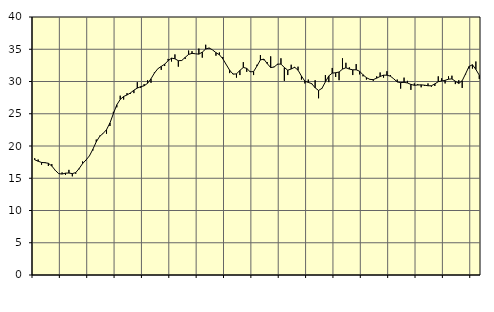
| Category | Piggar | Series 1 |
|---|---|---|
| nan | 18.1 | 17.86 |
| 87.0 | 17.9 | 17.64 |
| 87.0 | 17.1 | 17.45 |
| 87.0 | 17.5 | 17.41 |
| nan | 16.9 | 17.32 |
| 88.0 | 17.2 | 16.9 |
| 88.0 | 16.2 | 16.24 |
| 88.0 | 15.7 | 15.72 |
| nan | 15.9 | 15.65 |
| 89.0 | 15.5 | 15.79 |
| 89.0 | 16.3 | 15.81 |
| 89.0 | 15.3 | 15.72 |
| nan | 15.7 | 15.88 |
| 90.0 | 16.4 | 16.51 |
| 90.0 | 17.6 | 17.27 |
| 90.0 | 17.8 | 17.83 |
| nan | 18.5 | 18.47 |
| 91.0 | 19.3 | 19.49 |
| 91.0 | 21 | 20.65 |
| 91.0 | 21.6 | 21.49 |
| nan | 21.9 | 21.95 |
| 92.0 | 21.9 | 22.53 |
| 92.0 | 23.1 | 23.57 |
| 92.0 | 25.3 | 25.01 |
| nan | 26 | 26.38 |
| 93.0 | 27.8 | 27.22 |
| 93.0 | 27.2 | 27.68 |
| 93.0 | 28.2 | 27.91 |
| nan | 28.1 | 28.23 |
| 94.0 | 28.2 | 28.65 |
| 94.0 | 29.9 | 28.98 |
| 94.0 | 29 | 29.2 |
| nan | 29.6 | 29.33 |
| 95.0 | 30.2 | 29.72 |
| 95.0 | 29.8 | 30.42 |
| 95.0 | 31.4 | 31.3 |
| nan | 32 | 31.98 |
| 96.0 | 31.8 | 32.34 |
| 96.0 | 32.4 | 32.68 |
| 96.0 | 33.5 | 33.22 |
| nan | 33.1 | 33.62 |
| 97.0 | 34.2 | 33.52 |
| 97.0 | 32.3 | 33.22 |
| 97.0 | 33.3 | 33.26 |
| nan | 33.5 | 33.74 |
| 98.0 | 34.8 | 34.2 |
| 98.0 | 34.7 | 34.36 |
| 98.0 | 34.3 | 34.3 |
| nan | 35.1 | 34.24 |
| 99.0 | 33.7 | 34.55 |
| 99.0 | 35.7 | 35.04 |
| 99.0 | 35.1 | 35.2 |
| nan | 34.9 | 34.9 |
| 0.0 | 34 | 34.47 |
| 0.0 | 34.5 | 34.15 |
| 0.0 | 33.8 | 33.52 |
| nan | 32.6 | 32.63 |
| 1.0 | 31.3 | 31.75 |
| 1.0 | 31.2 | 31.14 |
| 1.0 | 30.6 | 31.18 |
| nan | 31 | 31.72 |
| 2.0 | 33 | 32.18 |
| 2.0 | 31.5 | 32.04 |
| 2.0 | 31.6 | 31.5 |
| nan | 31 | 31.54 |
| 3.0 | 32.6 | 32.41 |
| 3.0 | 34.1 | 33.35 |
| 3.0 | 33.3 | 33.47 |
| nan | 33 | 32.77 |
| 4.0 | 33.9 | 32.16 |
| 4.0 | 32.3 | 32.24 |
| 4.0 | 32.6 | 32.69 |
| nan | 33.6 | 32.7 |
| 5.0 | 30.1 | 32.17 |
| 5.0 | 31 | 31.75 |
| 5.0 | 32.6 | 31.94 |
| nan | 32.1 | 32.21 |
| 6.0 | 32.3 | 31.76 |
| 6.0 | 30.3 | 30.84 |
| 6.0 | 29.7 | 30.05 |
| nan | 30.3 | 29.86 |
| 7.0 | 29.6 | 29.67 |
| 7.0 | 30.2 | 29.02 |
| 7.0 | 27.4 | 28.61 |
| nan | 28.9 | 28.94 |
| 8.0 | 31 | 29.94 |
| 8.0 | 29.9 | 30.87 |
| 8.0 | 32.1 | 31.3 |
| nan | 30.7 | 31.36 |
| 9.0 | 30.2 | 31.47 |
| 9.0 | 33.6 | 31.92 |
| 9.0 | 32.9 | 32.13 |
| nan | 32.2 | 31.93 |
| 10.0 | 31 | 31.81 |
| 10.0 | 32.7 | 31.82 |
| 10.0 | 31.1 | 31.59 |
| nan | 30.8 | 31.04 |
| 11.0 | 30.3 | 30.59 |
| 11.0 | 30.3 | 30.33 |
| 11.0 | 30.1 | 30.29 |
| nan | 30.8 | 30.52 |
| 12.0 | 31.4 | 30.78 |
| 12.0 | 30.6 | 30.98 |
| 12.0 | 31.6 | 30.98 |
| nan | 31 | 30.83 |
| 13.0 | 30.4 | 30.41 |
| 13.0 | 30.3 | 29.93 |
| 13.0 | 28.9 | 29.83 |
| nan | 30.6 | 29.87 |
| 14.0 | 30.1 | 29.77 |
| 14.0 | 28.7 | 29.55 |
| 14.0 | 29.7 | 29.41 |
| nan | 29.6 | 29.46 |
| 15.0 | 29.1 | 29.48 |
| 15.0 | 29.3 | 29.43 |
| 15.0 | 29.7 | 29.34 |
| nan | 29.2 | 29.34 |
| 16.0 | 29.3 | 29.63 |
| 16.0 | 30.8 | 29.97 |
| 16.0 | 30.5 | 30.08 |
| nan | 29.7 | 30.18 |
| 17.0 | 30.8 | 30.36 |
| 17.0 | 30.9 | 30.4 |
| 17.0 | 29.6 | 30.04 |
| nan | 30.2 | 29.7 |
| 18.0 | 29 | 30.12 |
| 18.0 | 31.1 | 31.2 |
| 18.0 | 32 | 32.33 |
| nan | 32 | 32.6 |
| 19.0 | 33.1 | 31.87 |
| 19.0 | 30.4 | 30.98 |